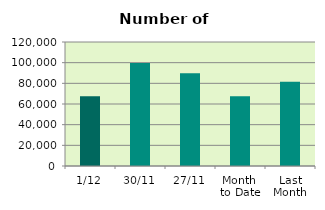
| Category | Series 0 |
|---|---|
| 1/12 | 67442 |
| 30/11 | 99688 |
| 27/11 | 89854 |
| Month 
to Date | 67442 |
| Last
Month | 81433.048 |